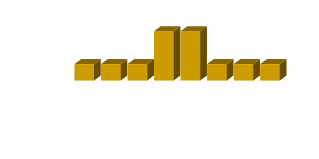
| Category | Total |
|---|---|
| Баянбулаг сум | 1 |
| Баянлиг сум | 1 |
| Баян-Өндөр сум | 1 |
| Богд сум | 3 |
| Боловсролын салбар | 3 |
| Бусад ТЕЗ-ийн харьяа | 1 |
| Жаргалант сум | 1 |
| Эрүүл мэндийн салбар | 1 |